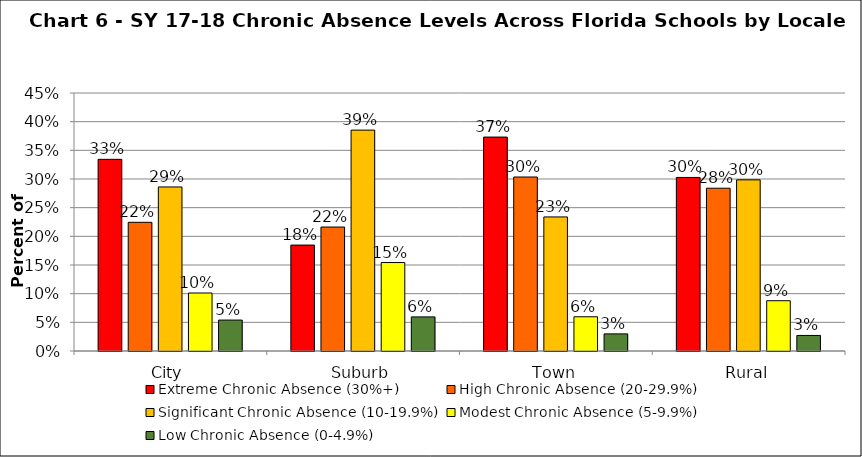
| Category | Extreme Chronic Absence (30%+) | High Chronic Absence (20-29.9%) | Significant Chronic Absence (10-19.9%) | Modest Chronic Absence (5-9.9%) | Low Chronic Absence (0-4.9%) |
|---|---|---|---|---|---|
| 0 | 0.334 | 0.224 | 0.286 | 0.101 | 0.054 |
| 1 | 0.185 | 0.216 | 0.385 | 0.154 | 0.059 |
| 2 | 0.373 | 0.303 | 0.234 | 0.06 | 0.03 |
| 3 | 0.303 | 0.284 | 0.299 | 0.088 | 0.027 |